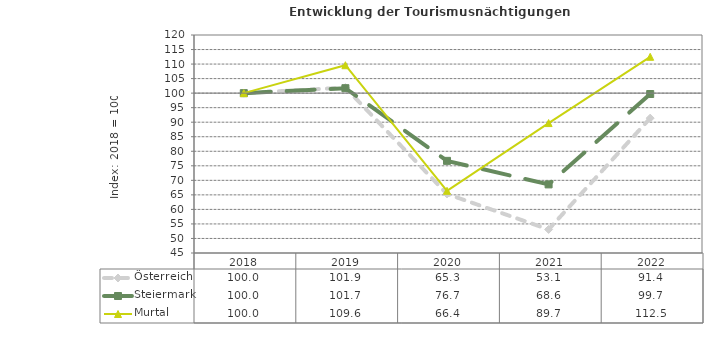
| Category | Österreich | Steiermark | Murtal |
|---|---|---|---|
| 2022.0 | 91.4 | 99.7 | 112.5 |
| 2021.0 | 53.1 | 68.6 | 89.7 |
| 2020.0 | 65.3 | 76.7 | 66.4 |
| 2019.0 | 101.9 | 101.7 | 109.6 |
| 2018.0 | 100 | 100 | 100 |